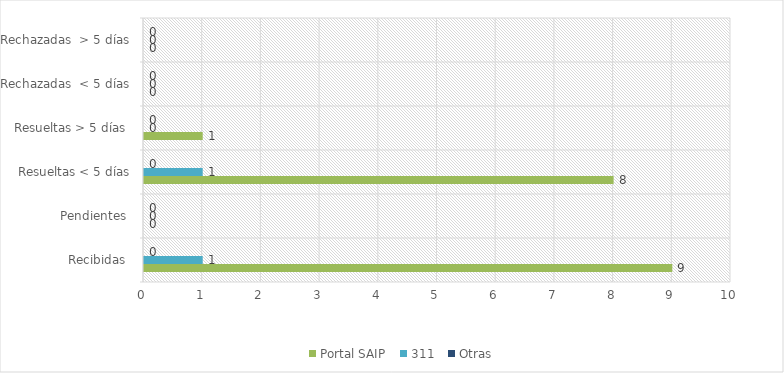
| Category | Portal SAIP | 311 | Otras |
|---|---|---|---|
| Recibidas  | 9 | 1 | 0 |
| Pendientes  | 0 | 0 | 0 |
| Resueltas < 5 días | 8 | 1 | 0 |
| Resueltas > 5 días  | 1 | 0 | 0 |
| Rechazadas  < 5 días | 0 | 0 | 0 |
| Rechazadas  > 5 días | 0 | 0 | 0 |